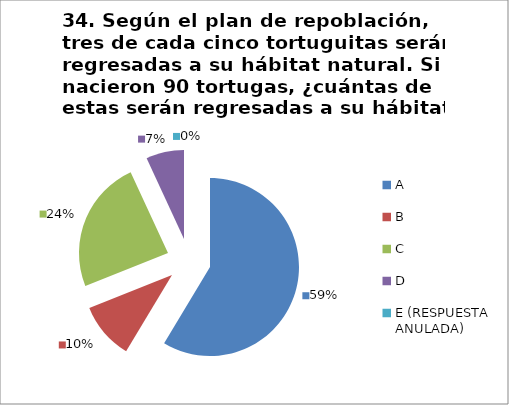
| Category | CANTIDAD DE RESPUESTAS PREGUNTA (34) | PORCENTAJE |
|---|---|---|
| A | 17 | 0.586 |
| B | 3 | 0.103 |
| C | 7 | 0.241 |
| D | 2 | 0.069 |
| E (RESPUESTA ANULADA) | 0 | 0 |